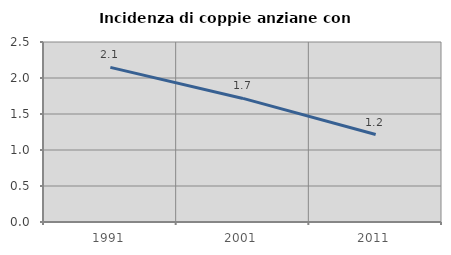
| Category | Incidenza di coppie anziane con figli |
|---|---|
| 1991.0 | 2.147 |
| 2001.0 | 1.716 |
| 2011.0 | 1.214 |